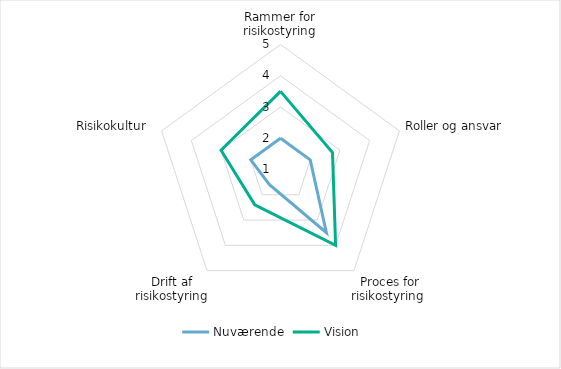
| Category | Nuværende | Vision |
|---|---|---|
| Rammer for risikostyring | 2 | 3.5 |
| Roller og ansvar | 2 | 2.75 |
| Proces for risikostyring  | 3.5 | 4 |
| Drift af risikostyring | 1.6 | 2.4 |
| Risikokultur  | 2 | 3 |